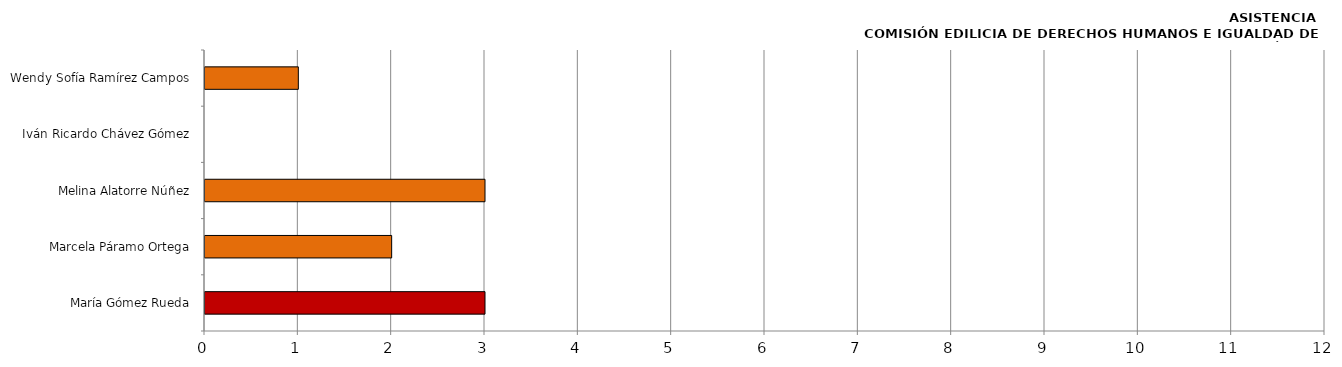
| Category | Series 0 |
|---|---|
| María Gómez Rueda | 3 |
| Marcela Páramo Ortega | 2 |
| Melina Alatorre Núñez | 3 |
| Iván Ricardo Chávez Gómez | 0 |
| Wendy Sofía Ramírez Campos | 1 |